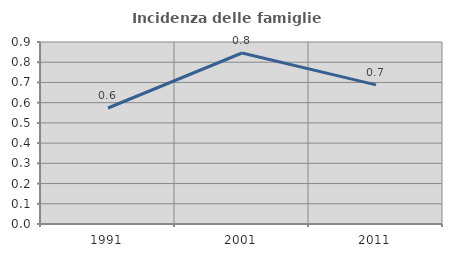
| Category | Incidenza delle famiglie numerose |
|---|---|
| 1991.0 | 0.574 |
| 2001.0 | 0.846 |
| 2011.0 | 0.688 |